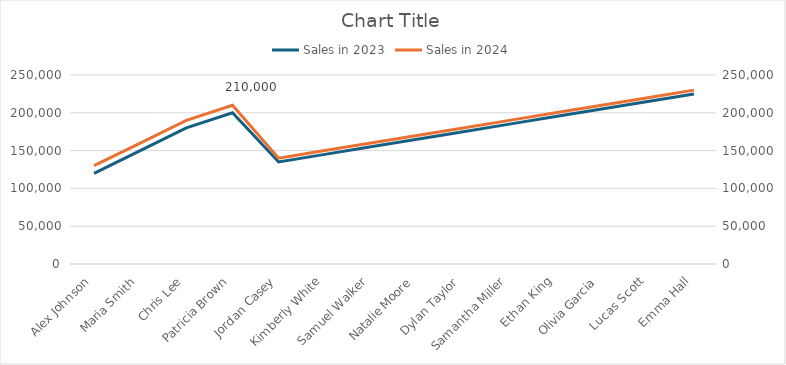
| Category | Sales in 2023 |
|---|---|
| Alex Johnson | 120000 |
| Maria Smith | 150000 |
| Chris Lee | 180000 |
| Patricia Brown | 200000 |
| Jordan Casey | 135000 |
| Kimberly White | 145000 |
| Samuel Walker | 155000 |
| Natalie Moore | 165000 |
| Dylan Taylor | 175000 |
| Samantha Miller | 185000 |
| Ethan King | 195000 |
| Olivia Garcia | 205000 |
| Lucas Scott | 215000 |
| Emma Hall | 225000 |